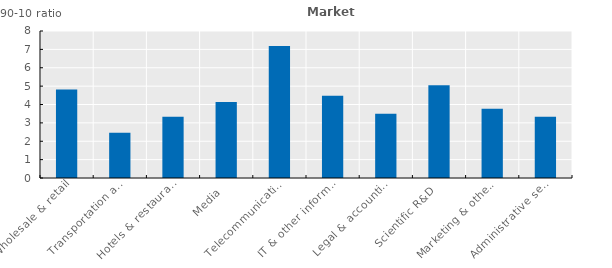
| Category | Series 0 |
|---|---|
| Wholesale & retail | 4.811 |
| Transportation and storage | 2.466 |
| Hotels & restaurants | 3.339 |
| Media  | 4.135 |
| Telecommunications  | 7.188 |
| IT & other information serv. | 4.47 |
| Legal & accounting | 3.497 |
| Scientific R&D  | 5.052 |
| Marketing & other  | 3.763 |
| Administrative services  | 3.332 |